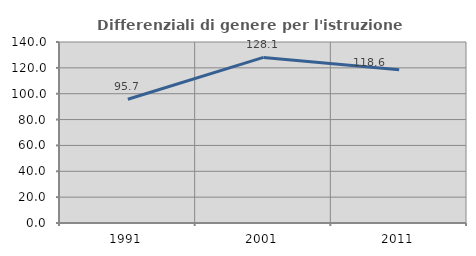
| Category | Differenziali di genere per l'istruzione superiore |
|---|---|
| 1991.0 | 95.673 |
| 2001.0 | 128.072 |
| 2011.0 | 118.622 |